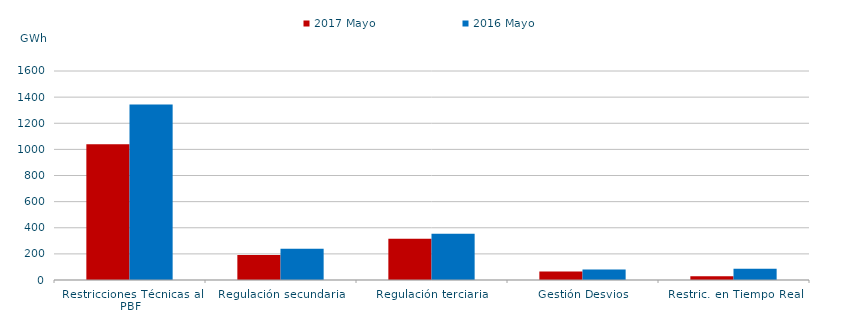
| Category | 2017 | 2016 |
|---|---|---|
| Restricciones Técnicas al PBF | 1038.656 | 1343.587 |
| Regulación secundaria | 191.909 | 240.041 |
| Regulación terciaria | 315.962 | 354.474 |
| Gestión Desvios | 65.169 | 80.053 |
| Restric. en Tiempo Real | 29.116 | 86.511 |